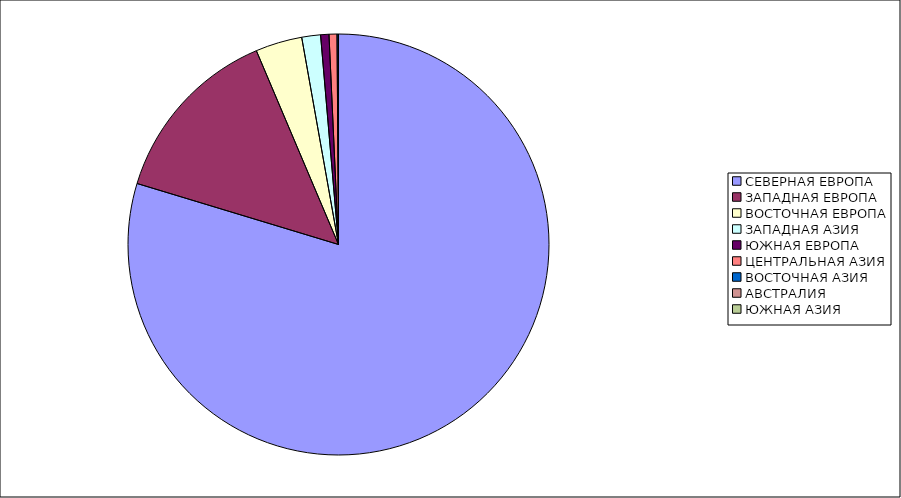
| Category | Оборот |
|---|---|
| СЕВЕРНАЯ ЕВРОПА | 79.68 |
| ЗАПАДНАЯ ЕВРОПА | 13.94 |
| ВОСТОЧНАЯ ЕВРОПА | 3.58 |
| ЗАПАДНАЯ АЗИЯ | 1.44 |
| ЮЖНАЯ ЕВРОПА | 0.64 |
| ЦЕНТРАЛЬНАЯ АЗИЯ | 0.61 |
| ВОСТОЧНАЯ АЗИЯ | 0.11 |
| АВСТРАЛИЯ | 0 |
| ЮЖНАЯ АЗИЯ | 0 |